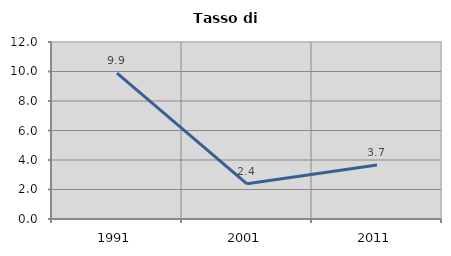
| Category | Tasso di disoccupazione   |
|---|---|
| 1991.0 | 9.885 |
| 2001.0 | 2.385 |
| 2011.0 | 3.664 |